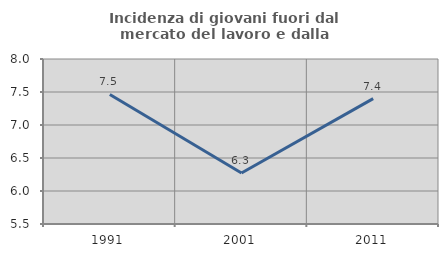
| Category | Incidenza di giovani fuori dal mercato del lavoro e dalla formazione  |
|---|---|
| 1991.0 | 7.463 |
| 2001.0 | 6.272 |
| 2011.0 | 7.4 |